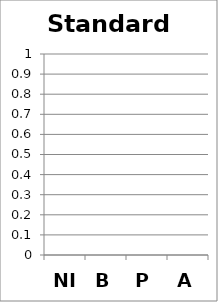
| Category | Standard 11 |
|---|---|
| NI | 0 |
| B | 0 |
| P | 0 |
| A | 0 |